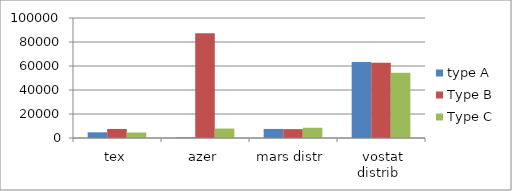
| Category | type A | Type B | Type C |
|---|---|---|---|
| tex | 4725.3 | 7544 | 4547 |
| azer | 451 | 87200 | 7854 |
| mars distr | 7555 | 7411 | 8544 |
| vostat distrib | 63240 | 62785 | 54433 |